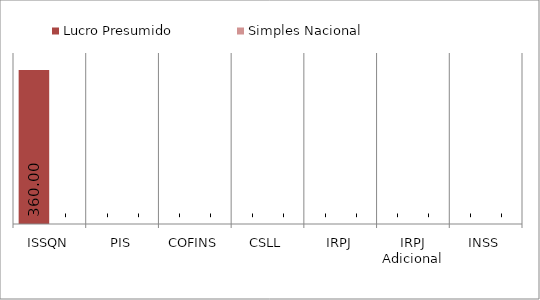
| Category | Lucro Presumido | Simples Nacional |
|---|---|---|
| ISSQN | 360 | 0 |
| PIS | 0 | 0 |
| COFINS | 0 | 0 |
| CSLL | 0 | 0 |
| IRPJ | 0 | 0 |
| IRPJ Adicional | 0 | 0 |
| INSS | 0 | 0 |